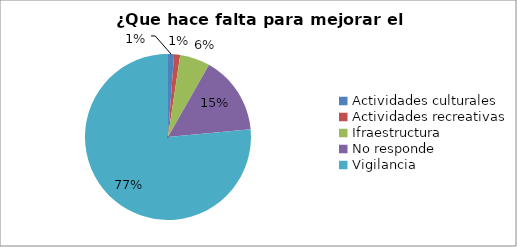
| Category | Series 0 |
|---|---|
| Actividades culturales | 0.012 |
| Actividades recreativas | 0.012 |
| Ifraestructura | 0.059 |
| No responde | 0.153 |
| Vigilancia  | 0.765 |